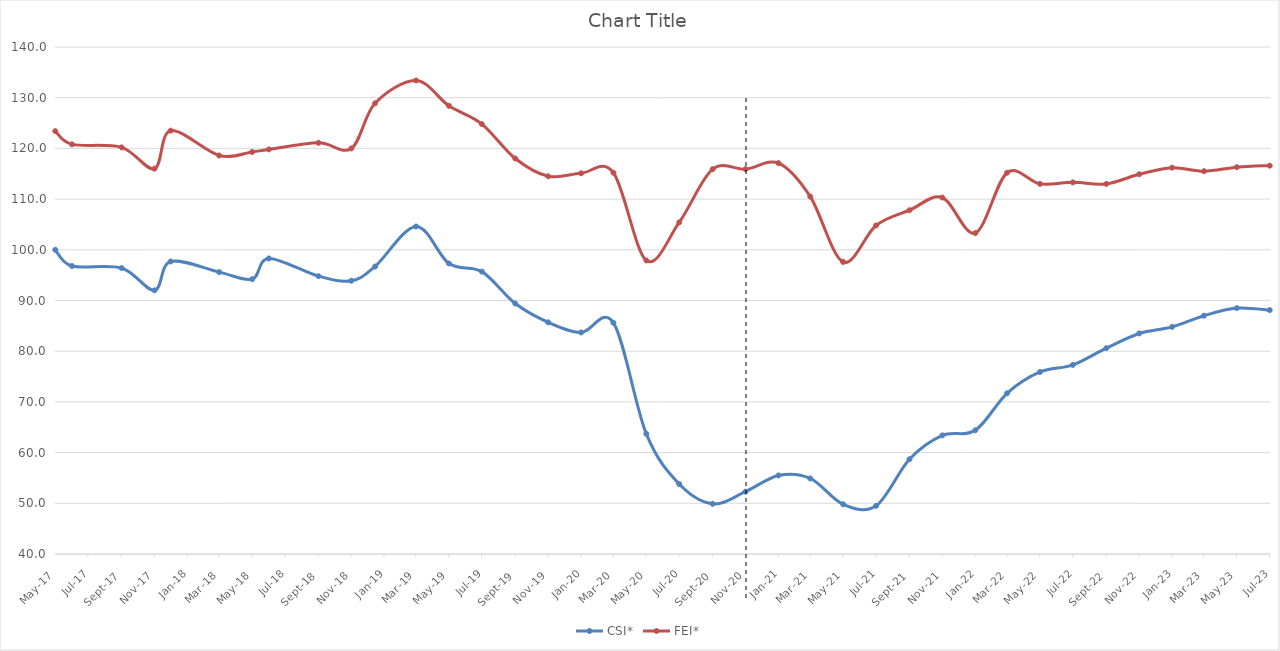
| Category | CSI* | FEI* |
|---|---|---|
| 2017-05-01 | 100 | 123.4 |
| 2017-06-01 | 96.8 | 120.8 |
| 2017-09-01 | 96.4 | 120.2 |
| 2017-11-01 | 92 | 116 |
| 2017-12-01 | 97.7 | 123.5 |
| 2018-03-01 | 95.6 | 118.6 |
| 2018-05-01 | 94.2 | 119.3 |
| 2018-06-01 | 98.3 | 119.8 |
| 2018-09-01 | 94.8 | 121.1 |
| 2018-11-01 | 93.9 | 120 |
| 2018-12-15 | 96.7 | 128.9 |
| 2019-03-01 | 104.6 | 133.4 |
| 2019-05-01 | 97.3 | 128.4 |
| 2019-07-01 | 95.7 | 124.8 |
| 2019-09-01 | 89.4 | 118 |
| 2019-11-01 | 85.7 | 114.5 |
| 2020-01-01 | 83.7 | 115.1 |
| 2020-03-01 | 85.6 | 115.2 |
| 2020-05-01 | 63.7 | 97.9 |
| 2020-07-01 | 53.8 | 105.4 |
| 2020-09-01 | 49.9 | 115.9 |
| 2020-11-01 | 52.3 | 115.9 |
| 2021-01-01 | 55.5 | 117.1 |
| 2021-03-01 | 54.9 | 110.5 |
| 2021-05-01 | 49.8 | 97.6 |
| 2021-07-01 | 49.5 | 104.8 |
| 2021-09-01 | 58.7 | 107.8 |
| 2021-11-01 | 63.4 | 110.3 |
| 2022-01-01 | 64.4 | 103.3 |
| 2022-03-01 | 71.7 | 115.2 |
| 2022-05-01 | 75.9 | 113 |
| 2022-07-01 | 77.3 | 113.3 |
| 2022-09-01 | 80.6 | 113 |
| 2022-11-01 | 83.5 | 114.9 |
| 2023-01-01 | 84.8 | 116.2 |
| 2023-03-01 | 87 | 115.5 |
| 2023-05-01 | 88.5 | 116.3 |
| 2023-07-01 | 88.1 | 116.6 |